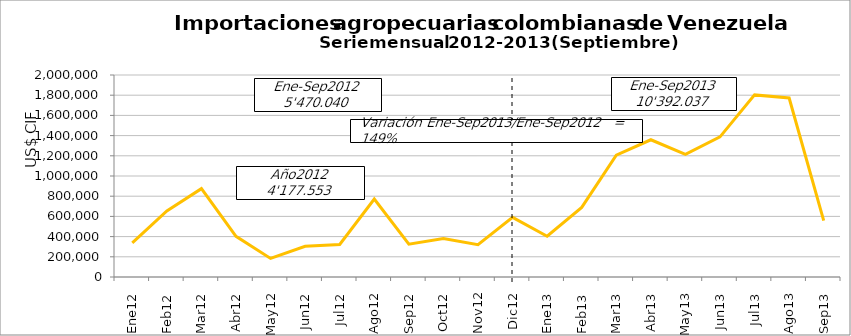
| Category | Series 0 |
|---|---|
| 0 | 337056.01 |
| 1 | 653893.77 |
| 2 | 874980.17 |
| 3 | 402712.19 |
| 4 | 184211 |
| 5 | 304585.65 |
| 6 | 322488.6 |
| 7 | 772192.32 |
| 8 | 325433.45 |
| 9 | 381687.18 |
| 10 | 320579.74 |
| 11 | 590220.19 |
| 12 | 403327.63 |
| 13 | 688697.92 |
| 14 | 1206767.42 |
| 15 | 1358859.69 |
| 16 | 1213690.31 |
| 17 | 1387416.92 |
| 18 | 1802848.74 |
| 19 | 1772370.23 |
| 20 | 558057.96 |